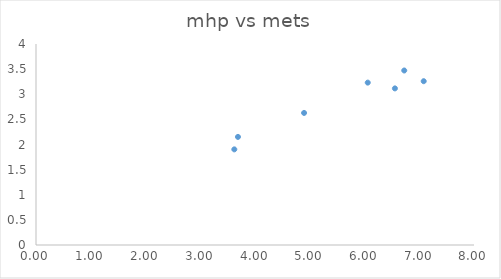
| Category | mhp vs mets  |
|---|---|
| 3.6888888888888887 | 2.151 |
| 3.622222222222222 | 1.903 |
| 4.896296296296296 | 2.628 |
| 6.0592592592592585 | 3.232 |
| 6.725925925925925 | 3.473 |
| 6.555555555555555 | 3.117 |
| 7.081481481481481 | 3.26 |